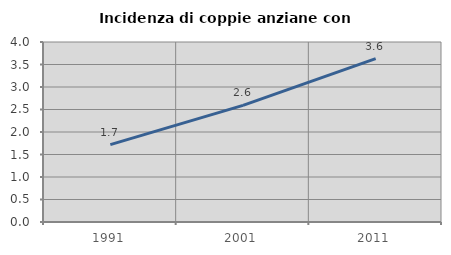
| Category | Incidenza di coppie anziane con figli |
|---|---|
| 1991.0 | 1.72 |
| 2001.0 | 2.591 |
| 2011.0 | 3.629 |